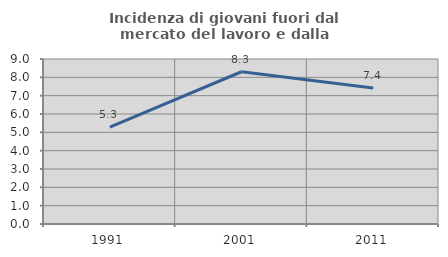
| Category | Incidenza di giovani fuori dal mercato del lavoro e dalla formazione  |
|---|---|
| 1991.0 | 5.278 |
| 2001.0 | 8.304 |
| 2011.0 | 7.418 |